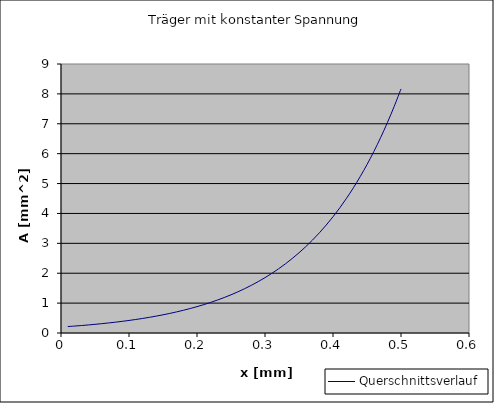
| Category | Querschnittsverlauf |
|---|---|
| 0.01 | 0.215 |
| 0.02 | 0.232 |
| 0.03 | 0.25 |
| 0.04 | 0.269 |
| 0.05 | 0.29 |
| 0.06 | 0.312 |
| 0.07 | 0.336 |
| 0.08 | 0.362 |
| 0.09 | 0.39 |
| 0.1 | 0.42 |
| 0.11 | 0.452 |
| 0.12 | 0.487 |
| 0.13 | 0.525 |
| 0.14 | 0.565 |
| 0.15 | 0.609 |
| 0.16 | 0.655 |
| 0.17 | 0.706 |
| 0.18 | 0.76 |
| 0.19 | 0.819 |
| 0.2 | 0.882 |
| 0.21 | 0.95 |
| 0.22 | 1.023 |
| 0.23 | 1.102 |
| 0.24 | 1.187 |
| 0.25 | 1.278 |
| 0.26 | 1.376 |
| 0.27 | 1.482 |
| 0.28 | 1.596 |
| 0.29 | 1.719 |
| 0.3 | 1.852 |
| 0.31 | 1.994 |
| 0.32 | 2.148 |
| 0.33 | 2.313 |
| 0.34 | 2.492 |
| 0.35 | 2.683 |
| 0.36 | 2.89 |
| 0.37 | 3.113 |
| 0.38 | 3.352 |
| 0.39 | 3.611 |
| 0.4 | 3.889 |
| 0.41 | 4.188 |
| 0.42 | 4.511 |
| 0.43 | 4.858 |
| 0.44 | 5.232 |
| 0.45 | 5.635 |
| 0.46 | 6.069 |
| 0.47 | 6.536 |
| 0.48 | 7.04 |
| 0.49 | 7.582 |
| 0.5 | 8.166 |